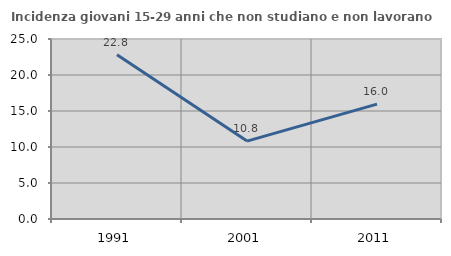
| Category | Incidenza giovani 15-29 anni che non studiano e non lavorano  |
|---|---|
| 1991.0 | 22.8 |
| 2001.0 | 10.82 |
| 2011.0 | 15.962 |